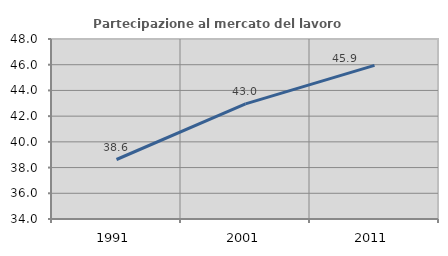
| Category | Partecipazione al mercato del lavoro  femminile |
|---|---|
| 1991.0 | 38.628 |
| 2001.0 | 42.957 |
| 2011.0 | 45.949 |